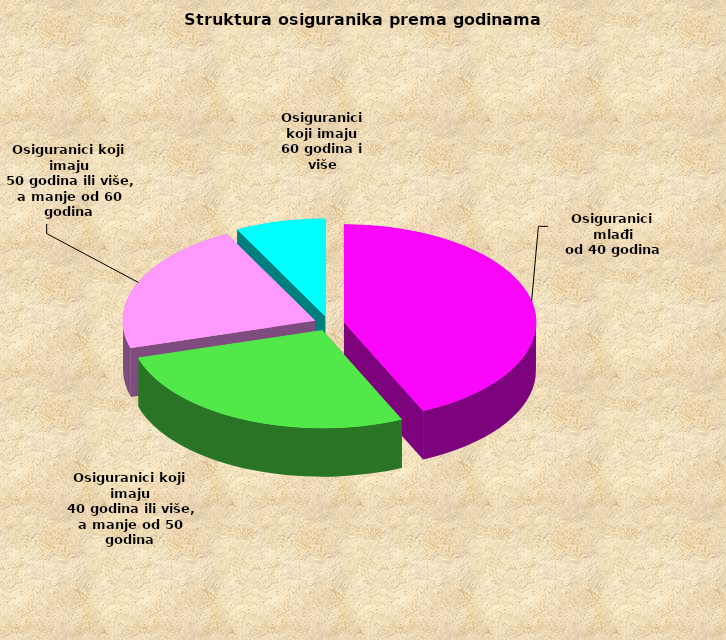
| Category | Series 0 |
|---|---|
| Osiguranici mlađi
od 40 godina | 707782 |
| Osiguranici koji imaju
 40 godina ili više, a manje od 50 godina | 445394 |
| Osiguranici koji imaju
 50 godina ili više, a manje od 60 godina | 359503 |
| Osiguranici koji imaju
60 godina i više | 124292 |